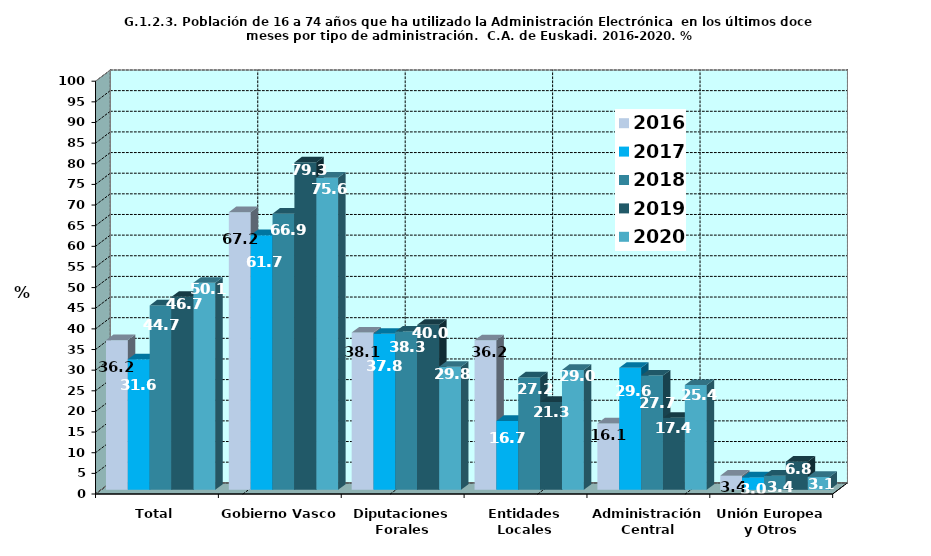
| Category | 2016 | 2017 | 2018 | 2019 | 2020 |
|---|---|---|---|---|---|
| Total | 36.231 | 31.608 | 44.663 | 46.748 | 50.139 |
| Gobierno Vasco | 67.249 | 61.687 | 66.88 | 79.325 | 75.608 |
| Diputaciones Forales | 38.099 | 37.801 | 38.329 | 39.981 | 29.789 |
| Entidades Locales | 36.213 | 16.693 | 27.228 | 21.273 | 29.035 |
| Administración Central | 16.081 | 29.562 | 27.688 | 17.433 | 25.367 |
| Unión Europea y Otros | 3.41 | 3.015 | 3.426 | 6.83 | 3.137 |